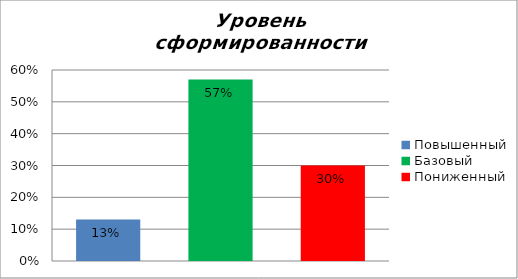
| Category | Уровень сформированности предметных результатов |
|---|---|
| Повышенный | 0.13 |
| Базовый | 0.57 |
| Пониженный | 0.3 |